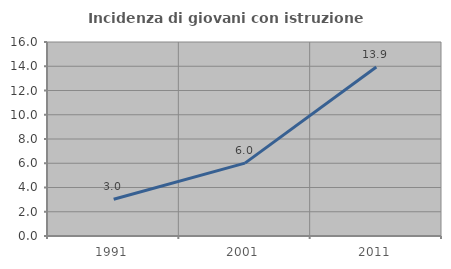
| Category | Incidenza di giovani con istruzione universitaria |
|---|---|
| 1991.0 | 3.03 |
| 2001.0 | 6.011 |
| 2011.0 | 13.932 |